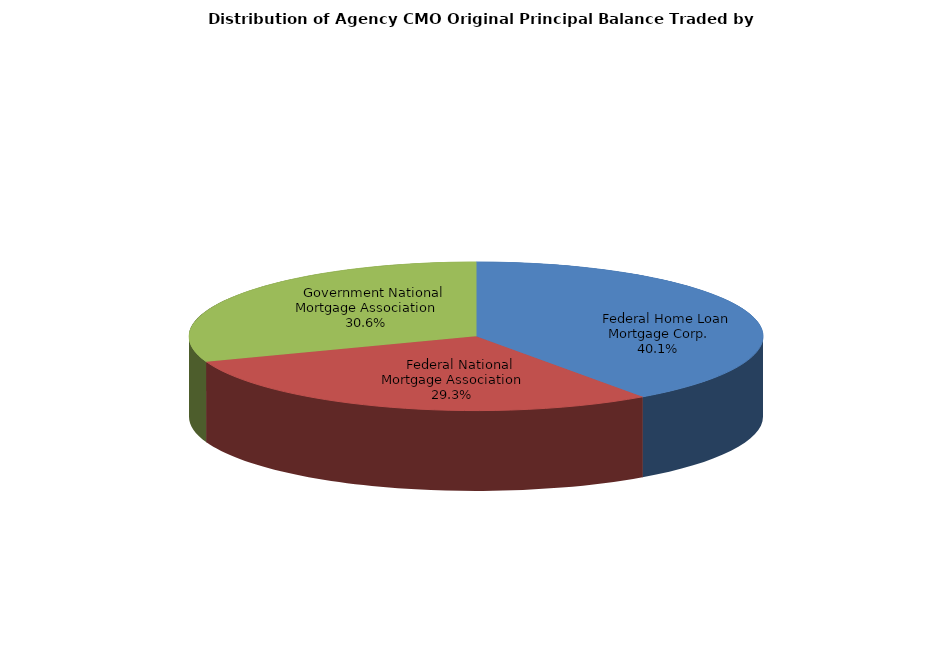
| Category | Series 0 |
|---|---|
|     Federal Home Loan Mortgage Corp. | 2943325181.115 |
|     Federal National Mortgage Association | 2146449521.244 |
|     Government National Mortgage Association | 2241329581.989 |